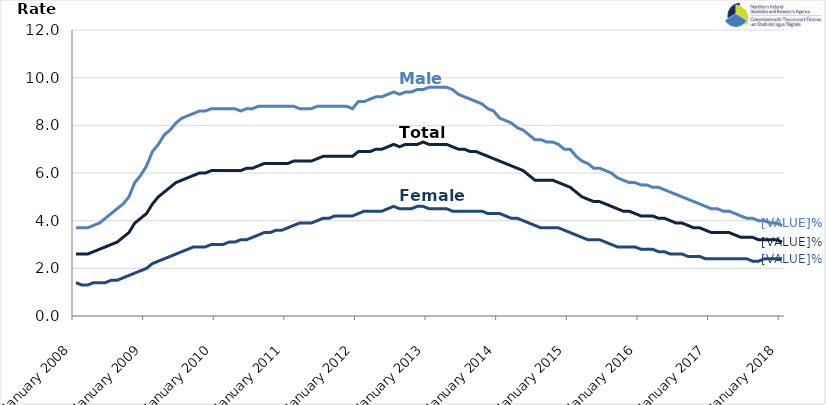
| Category | Male | Female | Total |
|---|---|---|---|
| 2008-01-01 | 3.7 | 1.4 | 2.6 |
| 2008-02-01 | 3.7 | 1.3 | 2.6 |
| 2008-03-01 | 3.7 | 1.3 | 2.6 |
| 2008-04-01 | 3.8 | 1.4 | 2.7 |
| 2008-05-01 | 3.9 | 1.4 | 2.8 |
| 2008-06-01 | 4.1 | 1.4 | 2.9 |
| 2008-07-01 | 4.3 | 1.5 | 3 |
| 2008-08-01 | 4.5 | 1.5 | 3.1 |
| 2008-09-01 | 4.7 | 1.6 | 3.3 |
| 2008-10-01 | 5 | 1.7 | 3.5 |
| 2008-11-01 | 5.6 | 1.8 | 3.9 |
| 2008-12-01 | 5.9 | 1.9 | 4.1 |
| 2009-01-01 | 6.3 | 2 | 4.3 |
| 2009-02-01 | 6.9 | 2.2 | 4.7 |
| 2009-03-01 | 7.2 | 2.3 | 5 |
| 2009-04-01 | 7.6 | 2.4 | 5.2 |
| 2009-05-01 | 7.8 | 2.5 | 5.4 |
| 2009-06-01 | 8.1 | 2.6 | 5.6 |
| 2009-07-01 | 8.3 | 2.7 | 5.7 |
| 2009-08-01 | 8.4 | 2.8 | 5.8 |
| 2009-09-01 | 8.5 | 2.9 | 5.9 |
| 2009-10-01 | 8.6 | 2.9 | 6 |
| 2009-11-01 | 8.6 | 2.9 | 6 |
| 2009-12-01 | 8.7 | 3 | 6.1 |
| 2010-01-01 | 8.7 | 3 | 6.1 |
| 2010-02-01 | 8.7 | 3 | 6.1 |
| 2010-03-01 | 8.7 | 3.1 | 6.1 |
| 2010-04-01 | 8.7 | 3.1 | 6.1 |
| 2010-05-01 | 8.6 | 3.2 | 6.1 |
| 2010-06-01 | 8.7 | 3.2 | 6.2 |
| 2010-07-01 | 8.7 | 3.3 | 6.2 |
| 2010-08-01 | 8.8 | 3.4 | 6.3 |
| 2010-09-01 | 8.8 | 3.5 | 6.4 |
| 2010-10-01 | 8.8 | 3.5 | 6.4 |
| 2010-11-01 | 8.8 | 3.6 | 6.4 |
| 2010-12-01 | 8.8 | 3.6 | 6.4 |
| 2011-01-01 | 8.8 | 3.7 | 6.4 |
| 2011-02-01 | 8.8 | 3.8 | 6.5 |
| 2011-03-01 | 8.7 | 3.9 | 6.5 |
| 2011-04-01 | 8.7 | 3.9 | 6.5 |
| 2011-05-01 | 8.7 | 3.9 | 6.5 |
| 2011-06-01 | 8.8 | 4 | 6.6 |
| 2011-07-01 | 8.8 | 4.1 | 6.7 |
| 2011-08-01 | 8.8 | 4.1 | 6.7 |
| 2011-09-01 | 8.8 | 4.2 | 6.7 |
| 2011-10-01 | 8.8 | 4.2 | 6.7 |
| 2011-11-01 | 8.8 | 4.2 | 6.7 |
| 2011-12-01 | 8.7 | 4.2 | 6.7 |
| 2012-01-01 | 9 | 4.3 | 6.9 |
| 2012-02-01 | 9 | 4.4 | 6.9 |
| 2012-03-01 | 9.1 | 4.4 | 6.9 |
| 2012-04-01 | 9.2 | 4.4 | 7 |
| 2012-05-01 | 9.2 | 4.4 | 7 |
| 2012-06-01 | 9.3 | 4.5 | 7.1 |
| 2012-07-01 | 9.4 | 4.6 | 7.2 |
| 2012-08-01 | 9.3 | 4.5 | 7.1 |
| 2012-09-01 | 9.4 | 4.5 | 7.2 |
| 2012-10-01 | 9.4 | 4.5 | 7.2 |
| 2012-11-01 | 9.5 | 4.6 | 7.2 |
| 2012-12-01 | 9.5 | 4.6 | 7.3 |
| 2013-01-01 | 9.6 | 4.5 | 7.2 |
| 2013-02-01 | 9.6 | 4.5 | 7.2 |
| 2013-03-01 | 9.6 | 4.5 | 7.2 |
| 2013-04-01 | 9.6 | 4.5 | 7.2 |
| 2013-05-01 | 9.5 | 4.4 | 7.1 |
| 2013-06-01 | 9.3 | 4.4 | 7 |
| 2013-07-01 | 9.2 | 4.4 | 7 |
| 2013-08-01 | 9.1 | 4.4 | 6.9 |
| 2013-09-01 | 9 | 4.4 | 6.9 |
| 2013-10-01 | 8.9 | 4.4 | 6.8 |
| 2013-11-01 | 8.7 | 4.3 | 6.7 |
| 2013-12-01 | 8.6 | 4.3 | 6.6 |
| 2014-01-01 | 8.3 | 4.3 | 6.5 |
| 2014-02-01 | 8.2 | 4.2 | 6.4 |
| 2014-03-01 | 8.1 | 4.1 | 6.3 |
| 2014-04-01 | 7.9 | 4.1 | 6.2 |
| 2014-05-01 | 7.8 | 4 | 6.1 |
| 2014-06-01 | 7.6 | 3.9 | 5.9 |
| 2014-07-01 | 7.4 | 3.8 | 5.7 |
| 2014-08-01 | 7.4 | 3.7 | 5.7 |
| 2014-09-01 | 7.3 | 3.7 | 5.7 |
| 2014-10-01 | 7.3 | 3.7 | 5.7 |
| 2014-11-01 | 7.2 | 3.7 | 5.6 |
| 2014-12-01 | 7 | 3.6 | 5.5 |
| 2015-01-01 | 7 | 3.5 | 5.4 |
| 2015-02-01 | 6.7 | 3.4 | 5.2 |
| 2015-03-01 | 6.5 | 3.3 | 5 |
| 2015-04-01 | 6.4 | 3.2 | 4.9 |
| 2015-05-01 | 6.2 | 3.2 | 4.8 |
| 2015-06-01 | 6.2 | 3.2 | 4.8 |
| 2015-07-01 | 6.1 | 3.1 | 4.7 |
| 2015-08-01 | 6 | 3 | 4.6 |
| 2015-09-01 | 5.8 | 2.9 | 4.5 |
| 2015-10-01 | 5.7 | 2.9 | 4.4 |
| 2015-11-01 | 5.6 | 2.9 | 4.4 |
| 2015-12-01 | 5.6 | 2.9 | 4.3 |
| 2016-01-01 | 5.5 | 2.8 | 4.2 |
| 2016-02-01 | 5.5 | 2.8 | 4.2 |
| 2016-03-01 | 5.4 | 2.8 | 4.2 |
| 2016-04-01 | 5.4 | 2.7 | 4.1 |
| 2016-05-01 | 5.3 | 2.7 | 4.1 |
| 2016-06-01 | 5.2 | 2.6 | 4 |
| 2016-07-01 | 5.1 | 2.6 | 3.9 |
| 2016-08-01 | 5 | 2.6 | 3.9 |
| 2016-09-01 | 4.9 | 2.5 | 3.8 |
| 2016-10-01 | 4.8 | 2.5 | 3.7 |
| 2016-11-01 | 4.7 | 2.5 | 3.7 |
| 2016-12-01 | 4.6 | 2.4 | 3.6 |
| 2017-01-01 | 4.5 | 2.4 | 3.5 |
| 2017-02-01 | 4.5 | 2.4 | 3.5 |
| 2017-03-01 | 4.4 | 2.4 | 3.5 |
| 2017-04-01 | 4.4 | 2.4 | 3.5 |
| 2017-05-01 | 4.3 | 2.4 | 3.4 |
| 2017-06-01 | 4.2 | 2.4 | 3.3 |
| 2017-07-01 | 4.1 | 2.4 | 3.3 |
| 2017-08-01 | 4.1 | 2.3 | 3.3 |
| 2017-09-01 | 4 | 2.3 | 3.2 |
| 2017-10-01 | 4 | 2.4 | 3.2 |
| 2017-11-01 | 3.9 | 2.4 | 3.2 |
| 2017-12-01 | 3.9 | 2.4 | 3.2 |
| 2018-01-01 | 3.8 | 2.4 | 3.1 |